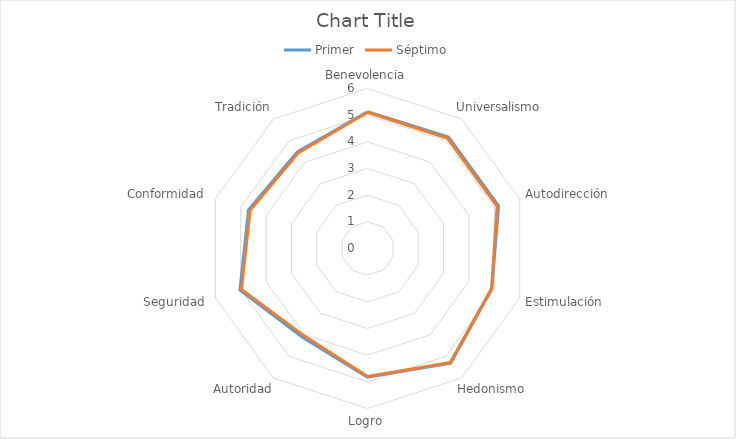
| Category | Primer | Séptimo |
|---|---|---|
| Benevolencia | 5.13 | 5.11 |
| Universalismo | 5.17 | 5.11 |
| Autodirección | 5.17 | 5.11 |
| Estimulación | 4.9 | 4.89 |
| Hedonismo | 5.31 | 5.28 |
| Logro | 4.83 | 4.8 |
| Autoridad | 4.13 | 4.05 |
| Seguridad | 5.03 | 4.97 |
| Conformidad | 4.69 | 4.63 |
| Tradición | 4.48 | 4.43 |